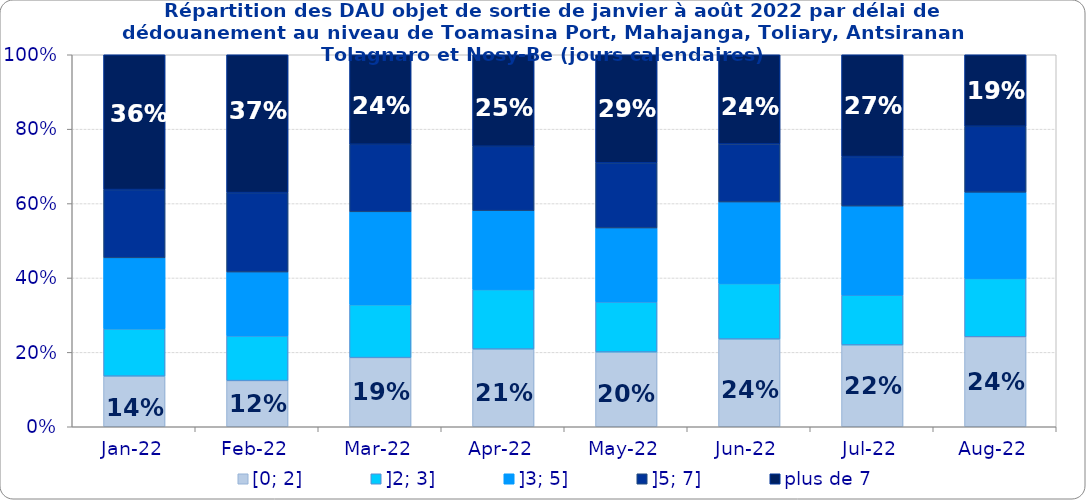
| Category | [0; 2] | ]2; 3] | ]3; 5] | ]5; 7] | plus de 7 |
|---|---|---|---|---|---|
| 2022-01-01 | 0.136 | 0.127 | 0.191 | 0.184 | 0.362 |
| 2022-02-01 | 0.124 | 0.12 | 0.172 | 0.213 | 0.371 |
| 2022-03-01 | 0.186 | 0.142 | 0.25 | 0.182 | 0.241 |
| 2022-04-01 | 0.209 | 0.16 | 0.212 | 0.173 | 0.246 |
| 2022-05-01 | 0.201 | 0.135 | 0.199 | 0.175 | 0.29 |
| 2022-06-01 | 0.236 | 0.149 | 0.219 | 0.156 | 0.24 |
| 2022-07-01 | 0.22 | 0.134 | 0.239 | 0.133 | 0.274 |
| 2022-08-01 | 0.242 | 0.157 | 0.232 | 0.177 | 0.192 |